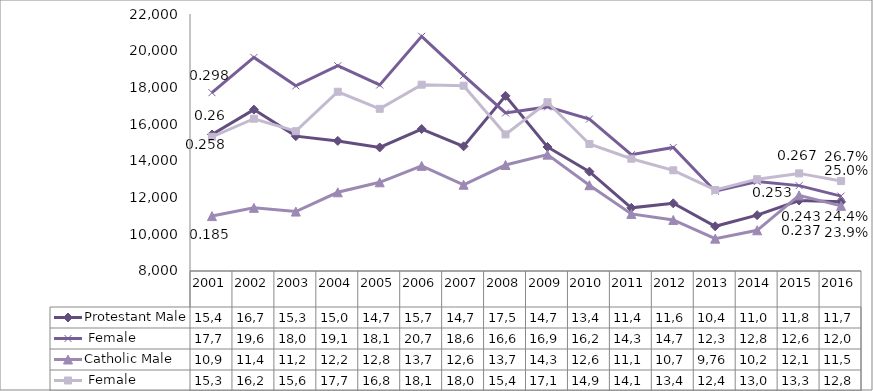
| Category | Protestant | Catholic |
|---|---|---|
| 2001.0 | 17713 | 15310 |
| 2002.0 | 19632 | 16295 |
| 2003.0 | 18086 | 15617 |
| 2004.0 | 19182 | 17764 |
| 2005.0 | 18133 | 16835 |
| 2006.0 | 20784 | 18149 |
| 2007.0 | 18657 | 18094 |
| 2008.0 | 16611 | 15440 |
| 2009.0 | 16939 | 17194 |
| 2010.0 | 16276 | 14917 |
| 2011.0 | 14333 | 14114 |
| 2012.0 | 14732 | 13485 |
| 2013.0 | 12347 | 12414 |
| 2014.0 | 12871 | 13003 |
| 2015.0 | 12651 | 13317 |
| 2016.0 | 12079 | 12898 |